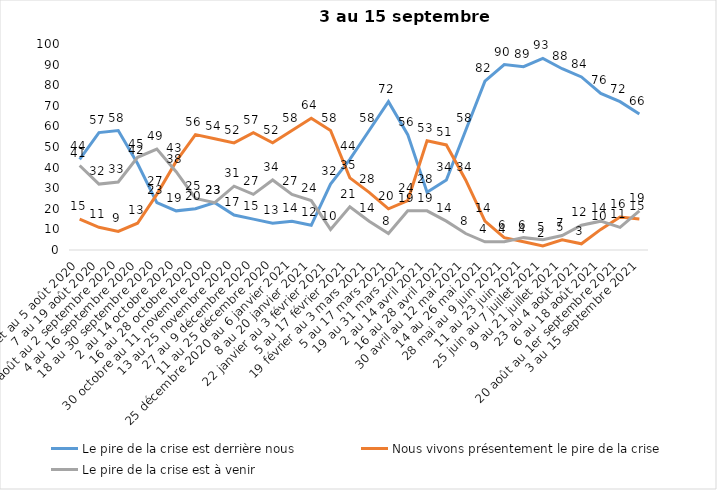
| Category | Le pire de la crise est derrière nous | Nous vivons présentement le pire de la crise | Le pire de la crise est à venir |
|---|---|---|---|
| 24 juillet au 5 août 2020 | 44 | 15 | 41 |
| 7 au 19 août 2020 | 57 | 11 | 32 |
| 21 août au 2 septembre 2020 | 58 | 9 | 33 |
| 4 au 16 septembre 2020 | 42 | 13 | 45 |
| 18 au 30 septembre 2020 | 23 | 27 | 49 |
| 2 au 14 octobre 2020 | 19 | 43 | 38 |
| 16 au 28 octobre 2020 | 20 | 56 | 25 |
| 30 octobre au 11 novembre 2020 | 23 | 54 | 23 |
| 13 au 25 novembre 2020 | 17 | 52 | 31 |
| 27 au 9 décembre 2020 | 15 | 57 | 27 |
| 11 au 25 décembre 2020 | 13 | 52 | 34 |
| 25 décembre 2020 au 6 janvier 2021 | 14 | 58 | 27 |
| 8 au 20 janvier 2021 | 12 | 64 | 24 |
| 22 janvier au 3 février 2021 | 32 | 58 | 10 |
| 5 au 17 février 2021 | 44 | 35 | 21 |
| 19 février au 3 mars 2021 | 58 | 28 | 14 |
| 5 au 17 mars 2021 | 72 | 20 | 8 |
| 19 au 31 mars 2021 | 56 | 24 | 19 |
| 2 au 14 avril 2021 | 28 | 53 | 19 |
| 16 au 28 avril 2021 | 34 | 51 | 14 |
| 30 avril au 12 mai 2021 | 58 | 34 | 8 |
| 14 au 26 mai 2021 | 82 | 14 | 4 |
| 28 mai au 9 juin 2021 | 90 | 6 | 4 |
| 11 au 23 juin 2021 | 89 | 4 | 6 |
| 25 juin au 7 juillet 2021 | 93 | 2 | 5 |
| 9 au 21 juillet 2021 | 88 | 5 | 7 |
| 23 au 4 août 2021 | 84 | 3 | 12 |
| 6 au 18 août 2021 | 76 | 10 | 14 |
| 20 août au 1er septembre 2021 | 72 | 16 | 11 |
| 3 au 15 septembre 2021 | 66 | 15 | 19 |